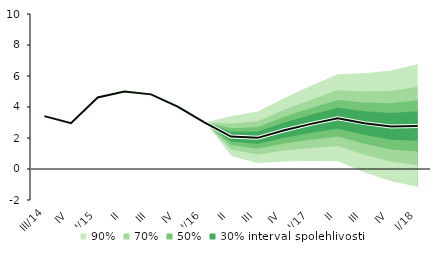
| Category | linka | Centerline |
|---|---|---|
| III/14 | 3.41 | 3.41 |
| IV | 2.96 | 2.96 |
| I/15 | 4.618 | 4.618 |
| II | 5.004 | 5.004 |
| III | 4.815 | 4.815 |
| IV | 4.027 | 4.027 |
| I/16 | 3.004 | 3.004 |
| II | 2.092 | 2.092 |
| III | 2.01 | 2.01 |
| IV | 2.503 | 2.503 |
| I/17 | 2.911 | 2.911 |
| II | 3.278 | 3.278 |
| III | 2.959 | 2.959 |
| IV | 2.75 | 2.75 |
| I/18 | 2.776 | 2.776 |